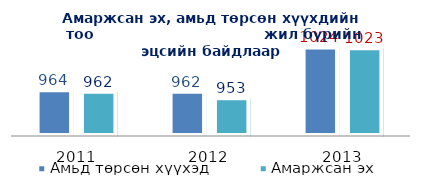
| Category | Амьд төрсөн хүүхэд | Амаржсан эх  |
|---|---|---|
| 2011.0 | 964 | 962 |
| 2012.0 | 962 | 953 |
| 2013.0 | 1024 | 1023 |